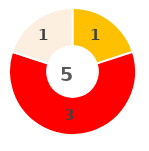
| Category | Series 0 |
|---|---|
| 0 | 0 |
| 1 | 0 |
| 2 | 1 |
| 3 | 3 |
| 4 | 1 |